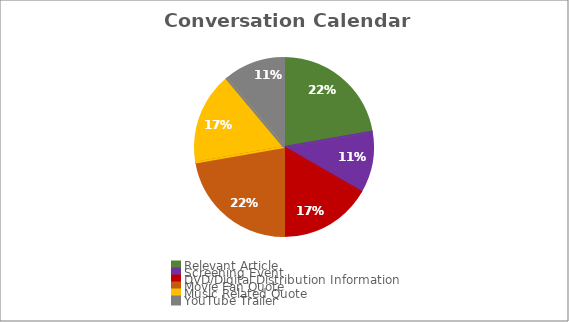
| Category | Series 0 |
|---|---|
| Relevant Article | 0.222 |
| Screening Event | 0.111 |
| DVD/Digital Distribution Information | 0.167 |
| Movie Fan Quote | 0.222 |
| Music Related Quote | 0.167 |
| YouTube Trailer | 0.111 |